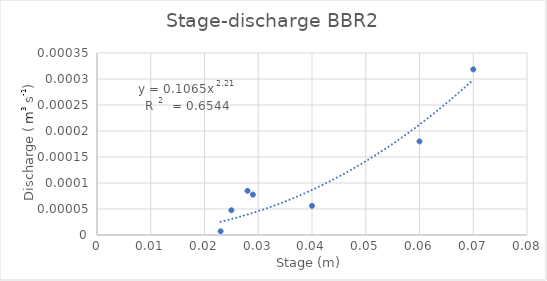
| Category | QA (m3/s) |
|---|---|
| 0.028999999999999998 | 0 |
| 0.07 | 0 |
| 0.06 | 0 |
| 0.028 | 0 |
| 0.025 | 0 |
| 0.023 | 0 |
| 0.04 | 0 |